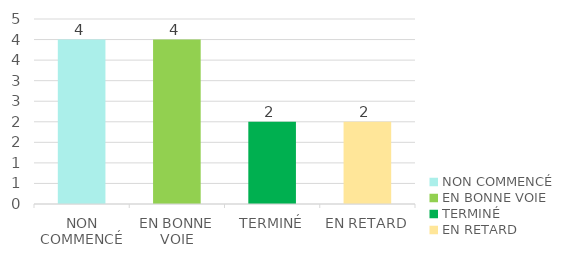
| Category | Series 0 |
|---|---|
| NON COMMENCÉ | 4 |
| EN BONNE VOIE | 4 |
| TERMINÉ | 2 |
| EN RETARD | 2 |